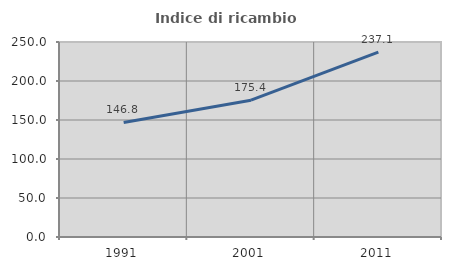
| Category | Indice di ricambio occupazionale  |
|---|---|
| 1991.0 | 146.841 |
| 2001.0 | 175.391 |
| 2011.0 | 237.088 |